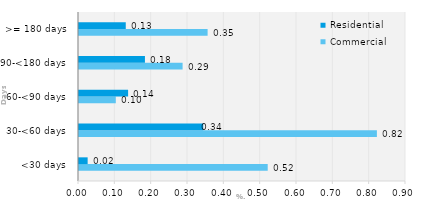
| Category | Commercial | Residential |
|---|---|---|
| <30 days | 0.519 | 0.024 |
| 30-<60 days | 0.82 | 0.342 |
| 60-<90 days | 0.101 | 0.135 |
| 90-<180 days | 0.285 | 0.181 |
| >= 180 days | 0.354 | 0.129 |